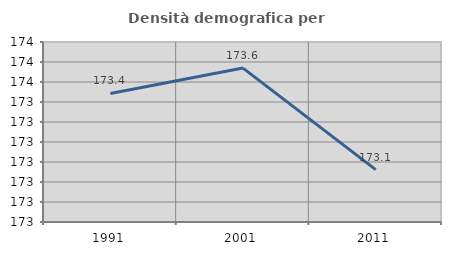
| Category | Densità demografica |
|---|---|
| 1991.0 | 173.443 |
| 2001.0 | 173.57 |
| 2011.0 | 173.062 |